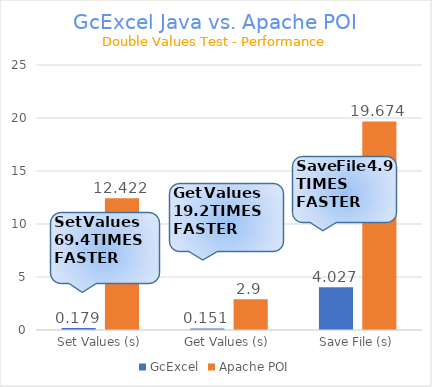
| Category | GcExcel | Apache POI |
|---|---|---|
| Set Values (s) | 0.179 | 12.422 |
| Get Values (s) | 0.151 | 2.9 |
| Save File (s) | 4.027 | 19.674 |